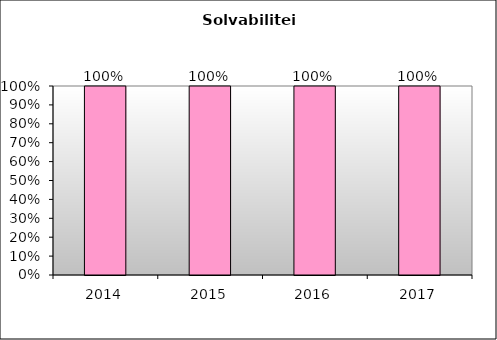
| Category | Series 0 |
|---|---|
| 2014.0 | 1 |
| 2015.0 | 1 |
| 2016.0 | 1 |
| 2017.0 | 1 |